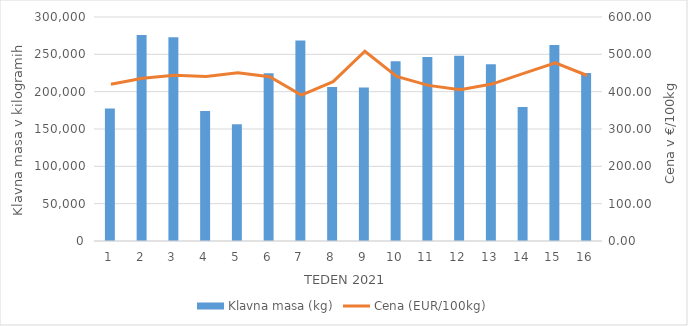
| Category | Klavna masa (kg) |
|---|---|
| 1.0 | 177573 |
| 2.0 | 275951 |
| 3.0 | 272797 |
| 4.0 | 174056 |
| 5.0 | 156508 |
| 6.0 | 224595 |
| 7.0 | 268436 |
| 8.0 | 206193 |
| 9.0 | 205669 |
| 10.0 | 240592 |
| 11.0 | 246325 |
| 12.0 | 248020 |
| 13.0 | 236703 |
| 14.0 | 179478 |
| 15.0 | 262544 |
| 16.0 | 225033 |